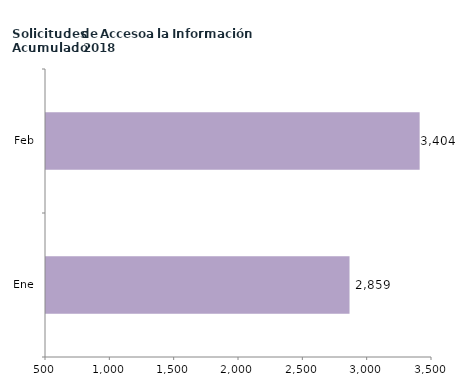
| Category | Series 0 |
|---|---|
| Ene | 2859 |
| Feb | 3404 |